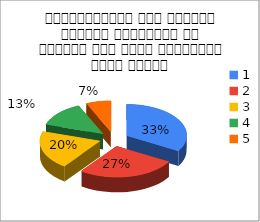
| Category | Series 0 | महाविद्यालय में उपलब्ध मूलभूत सुविधाओं के संदर्भ में अपनी संतुष्टि स्तर बताइए |
|---|---|---|
| 0 | 5 | 3 |
| 1 | 4 | 5 |
| 2 | 3 | 1 |
| 3 | 2 | 1 |
| 4 | 1 | 0 |